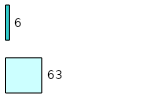
| Category | Series 0 | Series 1 |
|---|---|---|
| 0 | 63 | 6 |